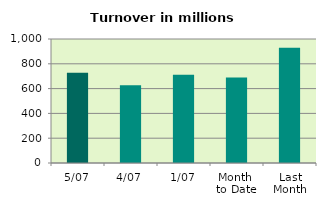
| Category | Series 0 |
|---|---|
| 5/07 | 728.225 |
| 4/07 | 627.901 |
| 1/07 | 710.863 |
| Month 
to Date | 688.996 |
| Last
Month | 929.439 |